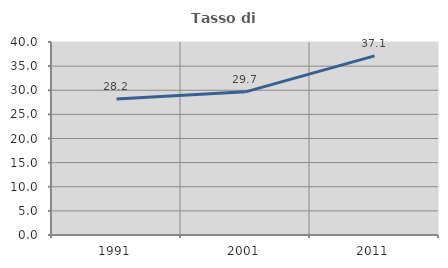
| Category | Tasso di occupazione   |
|---|---|
| 1991.0 | 28.175 |
| 2001.0 | 29.67 |
| 2011.0 | 37.123 |